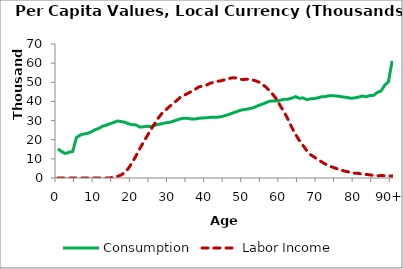
| Category | Consumption | Labor Income |
|---|---|---|
| 0 | 15176.25 | 0 |
|  | 13859.45 | 0 |
| 2 | 12784.68 | 0 |
| 3 | 13422 | 0 |
| 4 | 13862.6 | 0 |
| 5 | 21110.81 | 0 |
| 6 | 22425.02 | 0 |
| 7 | 22967.74 | 0 |
| 8 | 23362.12 | 0 |
| 9 | 24058.86 | 0 |
| 10 | 25239.56 | 0 |
| 11 | 25900.62 | 0 |
| 12 | 27025.5 | 0 |
| 13 | 27586.49 | 0 |
| 14 | 28295.39 | 0 |
| 15 | 28971.62 | 444.898 |
| 16 | 29764.45 | 825.657 |
| 17 | 29511.72 | 1545.223 |
| 18 | 29122.39 | 2879.404 |
| 19 | 28331.16 | 5014.888 |
| 20 | 27839.32 | 7988.243 |
| 21 | 27744.75 | 11475.27 |
| 22 | 26667.62 | 15090.44 |
| 23 | 26709.55 | 18551.4 |
| 24 | 27039.93 | 21814.42 |
| 25 | 26835.31 | 25233.37 |
| 26 | 27489.75 | 28127.94 |
| 27 | 28007.07 | 31240.79 |
| 28 | 28333.54 | 33703.82 |
| 29 | 28838.86 | 35466.11 |
| 30 | 29041.61 | 37230.22 |
| 31 | 29605.79 | 38794.59 |
| 32 | 30255.68 | 40495.77 |
| 33 | 30906.78 | 42217.61 |
| 34 | 31217.29 | 43202.3 |
| 35 | 31144.13 | 44228.08 |
| 36 | 30782.09 | 45249.14 |
| 37 | 30813.44 | 46388.91 |
| 38 | 31214.13 | 47617.48 |
| 39 | 31361.28 | 48027.33 |
| 40 | 31466.24 | 48503.92 |
| 41 | 31674.93 | 49518.82 |
| 42 | 31799.54 | 50020.61 |
| 43 | 31758.27 | 50530.25 |
| 44 | 32052.39 | 50800.2 |
| 45 | 32560.52 | 51370.23 |
| 46 | 33143.87 | 51963.54 |
| 47 | 33909.44 | 52344.88 |
| 48 | 34553.18 | 52274.46 |
| 49 | 35309.07 | 51539.07 |
| 50 | 35686.91 | 51458.76 |
| 51 | 36006.45 | 51647.6 |
| 52 | 36356.2 | 51416.05 |
| 53 | 36991.59 | 50928.11 |
| 54 | 37902.79 | 50227.3 |
| 55 | 38504.48 | 48910.42 |
| 56 | 39338.7 | 47551.46 |
| 57 | 40132.52 | 45584.76 |
| 58 | 40233.32 | 43379.33 |
| 59 | 40259.05 | 40855.62 |
| 60 | 40694.1 | 37375.53 |
| 61 | 41138.89 | 34180.82 |
| 62 | 41203.71 | 30534.41 |
| 63 | 41730.08 | 26387.11 |
| 64 | 42506.57 | 22774.72 |
| 65 | 41624.71 | 19645.05 |
| 66 | 41843.97 | 17029.1 |
| 67 | 40963.8 | 14362.55 |
| 68 | 41330.78 | 12217.18 |
| 69 | 41472.76 | 10929.07 |
| 70 | 41892.91 | 9673.281 |
| 71 | 42417.14 | 8485.609 |
| 72 | 42527.5 | 7277.123 |
| 73 | 42991.95 | 6243.616 |
| 74 | 42962.23 | 5647.92 |
| 75 | 42861.23 | 4940.218 |
| 76 | 42548.16 | 4275.415 |
| 77 | 42290.45 | 3729.297 |
| 78 | 42002.38 | 3253.463 |
| 79 | 41678.29 | 2838.76 |
| 80 | 41876.59 | 2445.194 |
| 81 | 42275.16 | 2421.162 |
| 82 | 42828.43 | 1836.341 |
| 83 | 42410.13 | 1842.665 |
| 84 | 43089.62 | 1684.057 |
| 85 | 43169.02 | 1297.387 |
| 86 | 44696.84 | 1143.838 |
| 87 | 45465.22 | 1291.98 |
| 88 | 48421.04 | 1209.493 |
| 89 | 50282.96 | 1133.159 |
| 90+ | 61169.46 | 1062.979 |